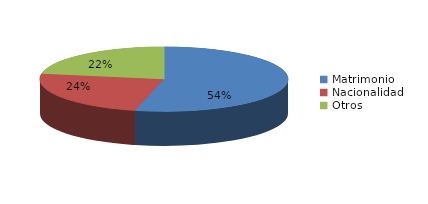
| Category | Series 0 |
|---|---|
| Matrimonio | 2237 |
| Nacionalidad | 998 |
| Otros | 928 |